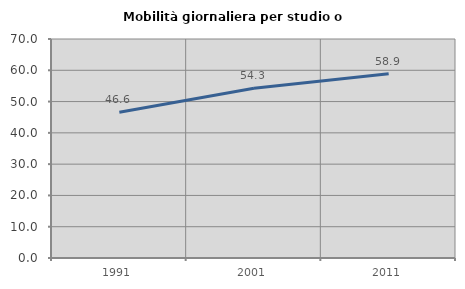
| Category | Mobilità giornaliera per studio o lavoro |
|---|---|
| 1991.0 | 46.571 |
| 2001.0 | 54.278 |
| 2011.0 | 58.877 |